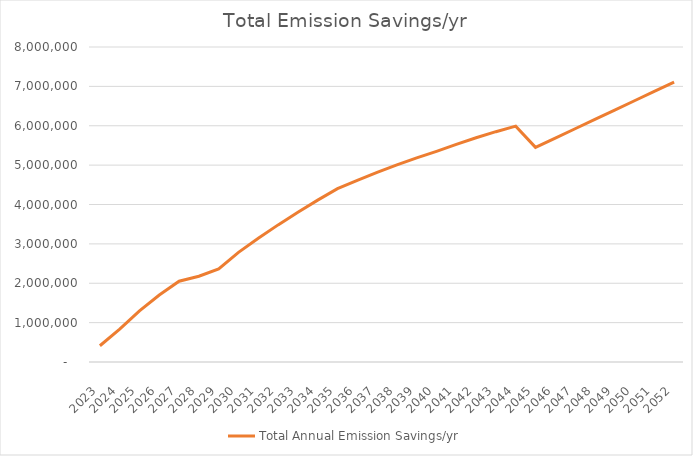
| Category | Total Annual Emission Savings/yr |
|---|---|
| 2023.0 | 412909.3 |
| 2024.0 | 835957.044 |
| 2025.0 | 1299332.386 |
| 2026.0 | 1700938.499 |
| 2027.0 | 2051120.167 |
| 2028.0 | 2177744.978 |
| 2029.0 | 2363407.457 |
| 2030.0 | 2783801.4 |
| 2031.0 | 3142932.778 |
| 2032.0 | 3482382.088 |
| 2033.0 | 3805724.579 |
| 2034.0 | 4111861.205 |
| 2035.0 | 4401632.38 |
| 2036.0 | 4614981.418 |
| 2037.0 | 4815187.063 |
| 2038.0 | 5004200.826 |
| 2039.0 | 5182243.228 |
| 2040.0 | 5350190.051 |
| 2041.0 | 5528538.903 |
| 2042.0 | 5695021.596 |
| 2043.0 | 5849220.025 |
| 2044.0 | 5990944.451 |
| 2045.0 | 5450311.437 |
| 2046.0 | 5687281.499 |
| 2047.0 | 5924251.562 |
| 2048.0 | 6161221.624 |
| 2049.0 | 6398191.687 |
| 2050.0 | 6635161.749 |
| 2051.0 | 6872131.812 |
| 2052.0 | 7109101.874 |